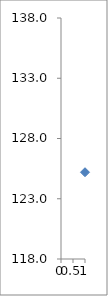
| Category | Series 0 |
|---|---|
| 0 | 125.2 |
| 1 | 132.3 |
| 2 | 126 |
| 3 | 128.5 |
| 4 | 124.8 |
| 5 | 122.4 |
| 6 | 118.9 |
| 7 | 120.9 |